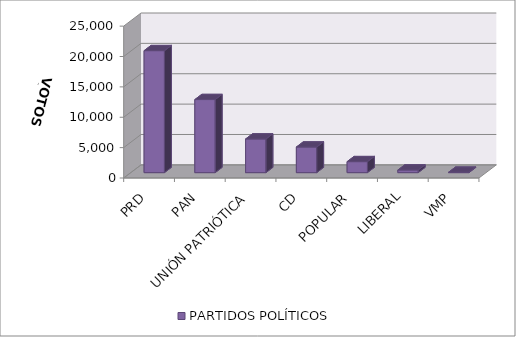
| Category | PARTIDOS POLÍTICOS |
|---|---|
| PRD | 20081 |
| PAN | 12030 |
| UNIÓN PATRIÓTICA | 5538 |
| CD | 4213 |
| POPULAR | 1810 |
| LIBERAL | 433 |
| VMP | 69 |